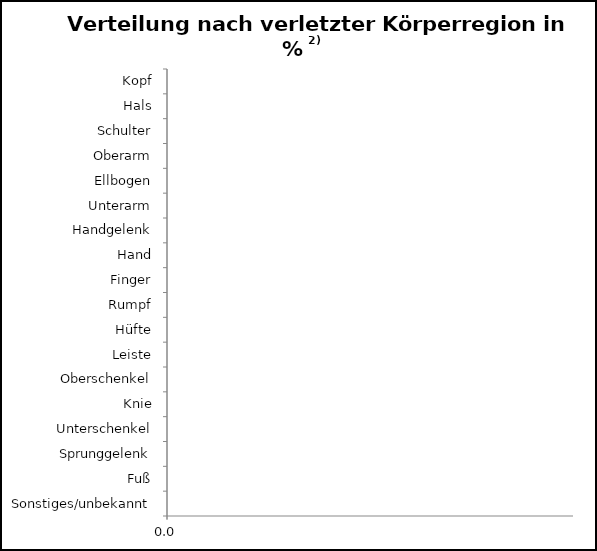
| Category | Series 0 |
|---|---|
| Sonstiges/unbekannt | 0 |
| Fuß | 0 |
| Sprunggelenk | 0 |
| Unterschenkel | 0 |
| Knie | 0 |
| Oberschenkel | 0 |
| Leiste | 0 |
| Hüfte | 0 |
| Rumpf | 0 |
| Finger | 0 |
| Hand | 0 |
| Handgelenk | 0 |
| Unterarm | 0 |
| Ellbogen | 0 |
| Oberarm | 0 |
| Schulter | 0 |
| Hals | 0 |
| Kopf | 0 |